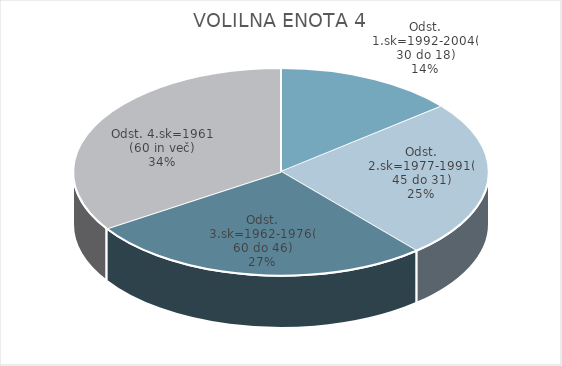
| Category | VOLILNA ENOTA 4 |
|---|---|
| Odst. 1.sk=1992-2004(30 do 18) | 10.19 |
| Odst. 2.sk=1977-1991(45 do 31) | 17.8 |
| Odst. 3.sk=1962-1976(60 do 46) | 19.58 |
| Odst. 4.sk=1961 (60 in več) | 24.7 |